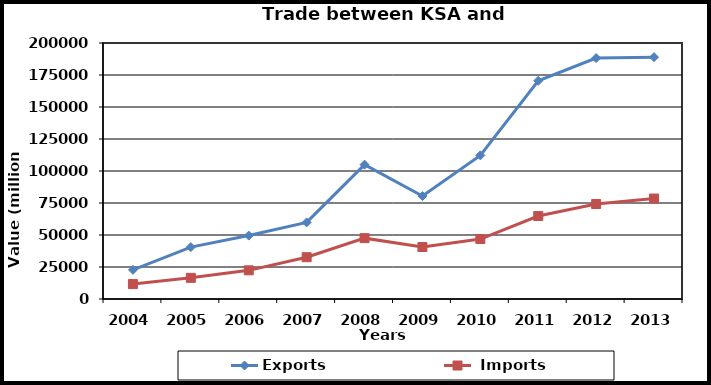
| Category | Exports |  Imports |
|---|---|---|
| 2004.0 | 22787 | 11681 |
| 2005.0 | 40519 | 16521 |
| 2006.0 | 49556 | 22391 |
| 2007.0 | 59840 | 32664 |
| 2008.0 | 104954 | 47541 |
| 2009.0 | 80417 | 40601 |
| 2010.0 | 112210 | 46851 |
| 2011.0 | 170500 | 64829 |
| 2012.0 | 188229 | 74195 |
| 2013.0 | 188936 | 78487 |